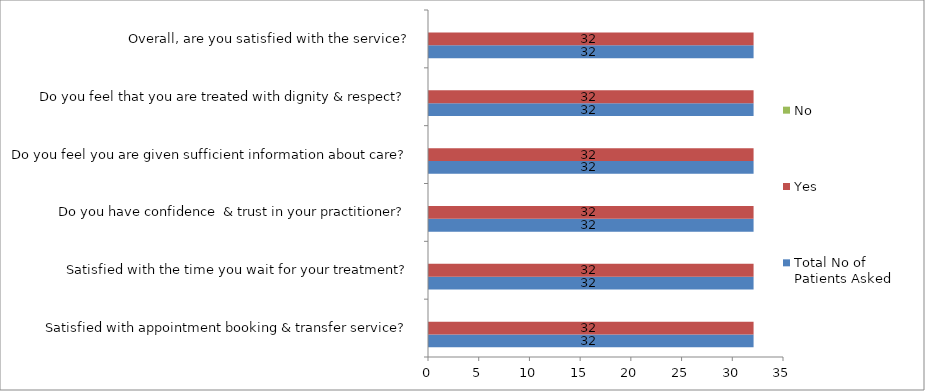
| Category | Total No of 
Patients Asked | Yes | No |
|---|---|---|---|
| Satisfied with appointment booking & transfer service? | 32 | 32 | 0 |
| Satisfied with the time you wait for your treatment? | 32 | 32 | 0 |
| Do you have confidence  & trust in your practitioner? | 32 | 32 | 0 |
| Do you feel you are given sufficient information about care? | 32 | 32 | 0 |
| Do you feel that you are treated with dignity & respect? | 32 | 32 | 0 |
| Overall, are you satisfied with the service? | 32 | 32 | 0 |